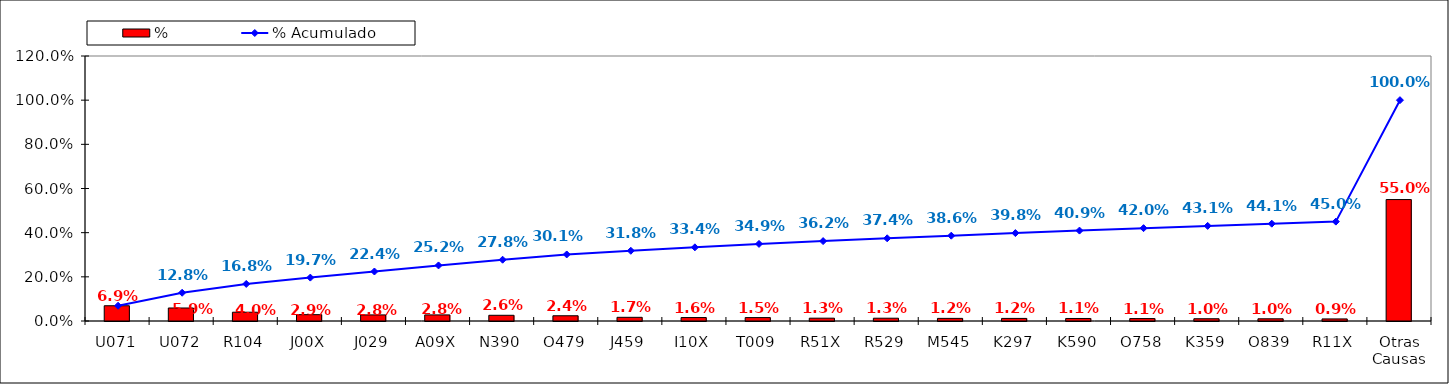
| Category | % |
|---|---|
| U071 | 0.069 |
| U072 | 0.059 |
| R104 | 0.04 |
| J00X | 0.029 |
| J029 | 0.028 |
| A09X | 0.028 |
| N390 | 0.026 |
| O479 | 0.024 |
| J459 | 0.017 |
| I10X | 0.016 |
| T009 | 0.015 |
| R51X | 0.013 |
| R529 | 0.013 |
| M545 | 0.012 |
| K297 | 0.012 |
| K590 | 0.011 |
| O758 | 0.011 |
| K359 | 0.01 |
| O839 | 0.01 |
| R11X | 0.009 |
| Otras Causas | 0.55 |